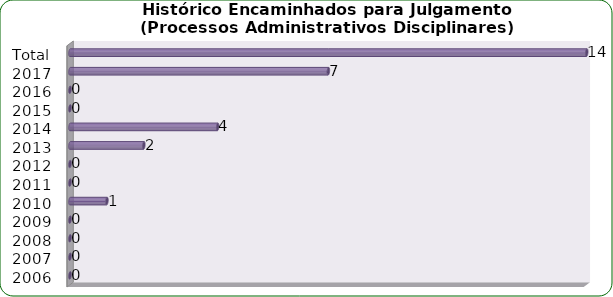
| Category | Total de Processos Administrativos Disciplinares |
|---|---|
| 2006 | 0 |
| 2007 | 0 |
| 2008 | 0 |
| 2009 | 0 |
| 2010 | 1 |
| 2011 | 0 |
| 2012 | 0 |
| 2013 | 2 |
| 2014 | 4 |
| 2015 | 0 |
| 2016 | 0 |
| 2017 | 7 |
| Total | 14 |